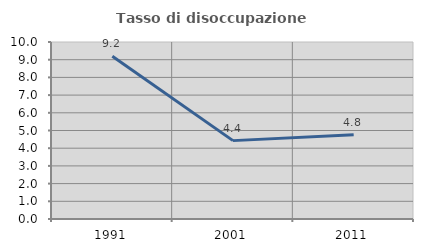
| Category | Tasso di disoccupazione giovanile  |
|---|---|
| 1991.0 | 9.189 |
| 2001.0 | 4.428 |
| 2011.0 | 4.762 |